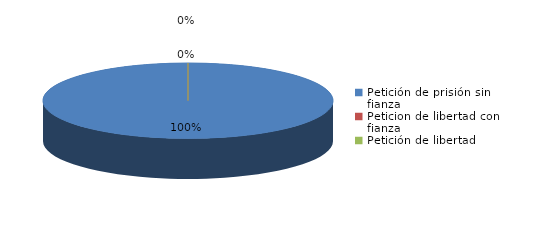
| Category | Series 0 |
|---|---|
| Petición de prisión sin fianza | 94 |
| Peticion de libertad con fianza | 0 |
| Petición de libertad | 0 |